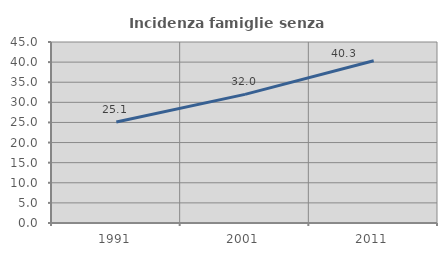
| Category | Incidenza famiglie senza nuclei |
|---|---|
| 1991.0 | 25.113 |
| 2001.0 | 31.983 |
| 2011.0 | 40.345 |